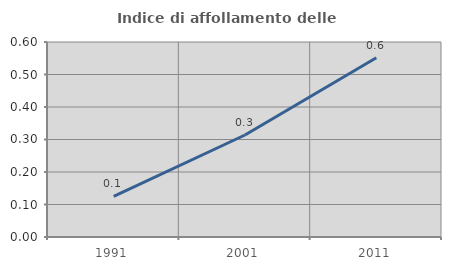
| Category | Indice di affollamento delle abitazioni  |
|---|---|
| 1991.0 | 0.125 |
| 2001.0 | 0.314 |
| 2011.0 | 0.551 |